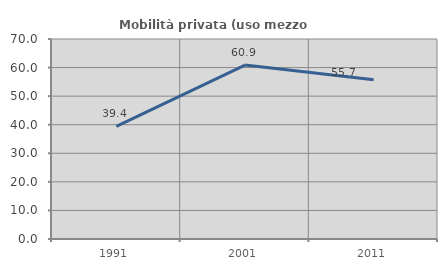
| Category | Mobilità privata (uso mezzo privato) |
|---|---|
| 1991.0 | 39.412 |
| 2001.0 | 60.87 |
| 2011.0 | 55.738 |